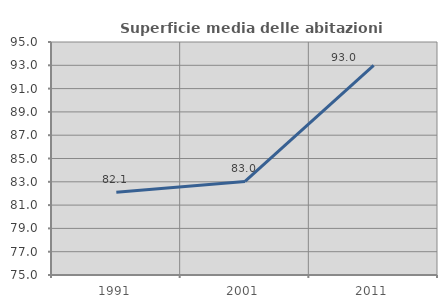
| Category | Superficie media delle abitazioni occupate |
|---|---|
| 1991.0 | 82.097 |
| 2001.0 | 83.033 |
| 2011.0 | 92.989 |